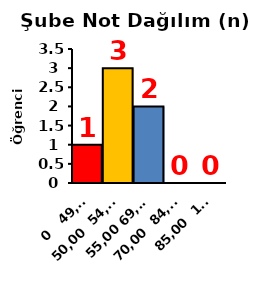
| Category | t |
|---|---|
| 0   49,99 | 1 |
| 50,00  54,99 | 3 |
| 55,00 69,99 | 2 |
| 70,00  84,99 | 0 |
| 85,00  100 | 0 |